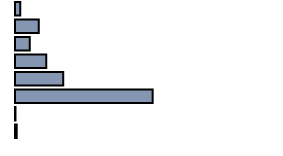
| Category | Series 0 |
|---|---|
| 0 | 1.996 |
| 1 | 8.985 |
| 2 | 5.609 |
| 3 | 11.902 |
| 4 | 18.337 |
| 5 | 52.34 |
| 6 | 0.184 |
| 7 | 0.646 |